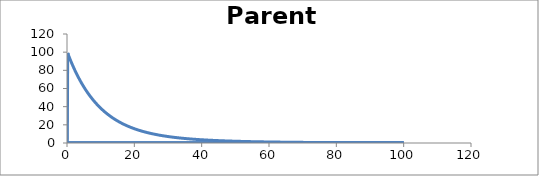
| Category | C - Sys 1 |
|---|---|
| 0.1 | 0 |
| 0.2 | 99.005 |
| 0.3 | 98.022 |
| 0.4 | 97.049 |
| 0.5 | 96.086 |
| 0.6 | 95.133 |
| 0.7000000000000001 | 94.191 |
| 0.8 | 93.259 |
| 0.9000000000000001 | 92.336 |
| 1.0 | 91.423 |
| 1.0999999999999999 | 90.52 |
| 1.2 | 89.626 |
| 1.3 | 88.742 |
| 1.4000000000000001 | 87.867 |
| 1.5 | 87.001 |
| 1.6 | 86.144 |
| 1.7000000000000002 | 85.296 |
| 1.8000000000000003 | 84.457 |
| 1.9 | 83.626 |
| 2.0 | 82.805 |
| 2.1 | 81.991 |
| 2.1999999999999997 | 81.187 |
| 2.3 | 80.39 |
| 2.4 | 79.602 |
| 2.5 | 78.822 |
| 2.6 | 78.05 |
| 2.7 | 77.286 |
| 2.8000000000000003 | 76.53 |
| 2.9000000000000004 | 75.782 |
| 3.0 | 75.042 |
| 3.1 | 74.309 |
| 3.2 | 73.584 |
| 3.3000000000000003 | 72.867 |
| 3.4000000000000004 | 72.157 |
| 3.5000000000000004 | 71.454 |
| 3.6000000000000005 | 70.759 |
| 3.6999999999999997 | 70.07 |
| 3.8 | 69.389 |
| 3.9 | 68.715 |
| 4.0 | 68.048 |
| 4.1000000000000005 | 67.388 |
| 4.2 | 66.734 |
| 4.300000000000001 | 66.088 |
| 4.3999999999999995 | 65.448 |
| 4.5 | 64.814 |
| 4.6 | 64.187 |
| 4.7 | 63.567 |
| 4.8 | 62.953 |
| 4.9 | 62.345 |
| 5.0 | 61.744 |
| 5.1000000000000005 | 61.149 |
| 5.2 | 60.56 |
| 5.3 | 59.977 |
| 5.4 | 59.4 |
| 5.5 | 58.828 |
| 5.6000000000000005 | 58.263 |
| 5.7 | 57.704 |
| 5.800000000000001 | 57.15 |
| 5.9 | 56.602 |
| 6.0 | 56.06 |
| 6.1 | 55.523 |
| 6.2 | 54.992 |
| 6.3 | 54.466 |
| 6.4 | 53.946 |
| 6.5 | 53.431 |
| 6.6000000000000005 | 52.921 |
| 6.7 | 52.416 |
| 6.800000000000001 | 51.917 |
| 6.9 | 51.423 |
| 7.000000000000001 | 50.933 |
| 7.1000000000000005 | 50.449 |
| 7.200000000000001 | 49.97 |
| 7.3 | 49.496 |
| 7.3999999999999995 | 49.026 |
| 7.5 | 48.561 |
| 7.6 | 48.101 |
| 7.7 | 47.646 |
| 7.8 | 47.195 |
| 7.9 | 46.749 |
| 8.0 | 46.308 |
| 8.1 | 45.871 |
| 8.200000000000001 | 45.438 |
| 8.3 | 45.01 |
| 8.4 | 44.587 |
| 8.5 | 44.167 |
| 8.600000000000001 | 43.752 |
| 8.700000000000001 | 43.341 |
| 8.799999999999999 | 42.934 |
| 8.9 | 42.532 |
| 9.0 | 42.133 |
| 9.1 | 41.739 |
| 9.2 | 41.348 |
| 9.3 | 40.962 |
| 9.4 | 40.579 |
| 9.5 | 40.2 |
| 9.6 | 39.825 |
| 9.700000000000001 | 39.454 |
| 9.8 | 39.087 |
| 9.9 | 38.723 |
| 10.0 | 38.363 |
| 10.100000000000001 | 38.007 |
| 10.200000000000001 | 37.654 |
| 10.3 | 37.305 |
| 10.4 | 36.959 |
| 10.5 | 36.617 |
| 10.6 | 36.279 |
| 10.7 | 35.943 |
| 10.8 | 35.612 |
| 10.9 | 35.283 |
| 11.0 | 34.958 |
| 11.1 | 34.636 |
| 11.200000000000001 | 34.317 |
| 11.3 | 34.002 |
| 11.4 | 33.689 |
| 11.5 | 33.38 |
| 11.600000000000001 | 33.074 |
| 11.700000000000001 | 32.771 |
| 11.8 | 32.471 |
| 11.9 | 32.174 |
| 12.0 | 31.88 |
| 12.1 | 31.589 |
| 12.2 | 31.301 |
| 12.3 | 31.016 |
| 12.4 | 30.733 |
| 12.5 | 30.454 |
| 12.6 | 30.177 |
| 12.7 | 29.903 |
| 12.8 | 29.632 |
| 12.9 | 29.363 |
| 13.0 | 29.097 |
| 13.100000000000001 | 28.834 |
| 13.200000000000001 | 28.574 |
| 13.3 | 28.316 |
| 13.4 | 28.06 |
| 13.5 | 27.807 |
| 13.600000000000001 | 27.557 |
| 13.700000000000001 | 27.309 |
| 13.8 | 27.064 |
| 13.900000000000002 | 26.821 |
| 14.000000000000002 | 26.58 |
| 14.100000000000001 | 26.342 |
| 14.200000000000001 | 26.106 |
| 14.3 | 25.873 |
| 14.400000000000002 | 25.641 |
| 14.499999999999998 | 25.413 |
| 14.6 | 25.186 |
| 14.7 | 24.962 |
| 14.799999999999999 | 24.74 |
| 14.899999999999999 | 24.52 |
| 15.0 | 24.302 |
| 15.1 | 24.086 |
| 15.2 | 23.873 |
| 15.299999999999999 | 23.661 |
| 15.4 | 23.452 |
| 15.5 | 23.245 |
| 15.6 | 23.039 |
| 15.7 | 22.836 |
| 15.8 | 22.635 |
| 15.9 | 22.436 |
| 16.0 | 22.239 |
| 16.1 | 22.043 |
| 16.2 | 21.85 |
| 16.3 | 21.658 |
| 16.400000000000002 | 21.469 |
| 16.5 | 21.281 |
| 16.6 | 21.095 |
| 16.7 | 20.911 |
| 16.8 | 20.729 |
| 16.900000000000002 | 20.548 |
| 17.0 | 20.369 |
| 17.1 | 20.192 |
| 17.200000000000003 | 20.017 |
| 17.3 | 19.843 |
| 17.400000000000002 | 19.671 |
| 17.5 | 19.501 |
| 17.599999999999998 | 19.333 |
| 17.7 | 19.166 |
| 17.8 | 19 |
| 17.9 | 18.837 |
| 18.0 | 18.675 |
| 18.099999999999998 | 18.514 |
| 18.2 | 18.355 |
| 18.3 | 18.198 |
| 18.4 | 18.042 |
| 18.5 | 17.887 |
| 18.6 | 17.734 |
| 18.7 | 17.583 |
| 18.8 | 17.433 |
| 18.9 | 17.284 |
| 19.0 | 17.137 |
| 19.1 | 16.992 |
| 19.2 | 16.847 |
| 19.3 | 16.704 |
| 19.400000000000002 | 16.563 |
| 19.5 | 16.423 |
| 19.6 | 16.284 |
| 19.7 | 16.146 |
| 19.8 | 16.01 |
| 19.900000000000002 | 15.875 |
| 20.0 | 15.742 |
| 20.1 | 15.609 |
| 20.200000000000003 | 15.478 |
| 20.3 | 15.349 |
| 20.400000000000002 | 15.22 |
| 20.5 | 15.093 |
| 20.6 | 14.967 |
| 20.700000000000003 | 14.842 |
| 20.8 | 14.718 |
| 20.9 | 14.596 |
| 21.0 | 14.474 |
| 21.099999999999998 | 14.354 |
| 21.2 | 14.235 |
| 21.3 | 14.117 |
| 21.4 | 14 |
| 21.5 | 13.884 |
| 21.6 | 13.77 |
| 21.7 | 13.656 |
| 21.8 | 13.544 |
| 21.9 | 13.432 |
| 22.0 | 13.322 |
| 22.1 | 13.213 |
| 22.2 | 13.104 |
| 22.3 | 12.997 |
| 22.400000000000002 | 12.891 |
| 22.5 | 12.786 |
| 22.6 | 12.681 |
| 22.7 | 12.578 |
| 22.8 | 12.476 |
| 22.900000000000002 | 12.374 |
| 23.0 | 12.274 |
| 23.1 | 12.175 |
| 23.200000000000003 | 12.076 |
| 23.3 | 11.978 |
| 23.400000000000002 | 11.882 |
| 23.5 | 11.786 |
| 23.6 | 11.691 |
| 23.700000000000003 | 11.597 |
| 23.8 | 11.504 |
| 23.900000000000002 | 11.412 |
| 24.0 | 11.32 |
| 24.099999999999998 | 11.23 |
| 24.2 | 11.14 |
| 24.3 | 11.051 |
| 24.4 | 10.963 |
| 24.5 | 10.876 |
| 24.6 | 10.789 |
| 24.7 | 10.703 |
| 24.8 | 10.619 |
| 24.9 | 10.534 |
| 25.0 | 10.451 |
| 25.1 | 10.369 |
| 25.2 | 10.287 |
| 25.3 | 10.206 |
| 25.4 | 10.125 |
| 25.5 | 10.046 |
| 25.6 | 9.967 |
| 25.7 | 9.889 |
| 25.8 | 9.812 |
| 25.900000000000002 | 9.735 |
| 26.0 | 9.659 |
| 26.1 | 9.584 |
| 26.200000000000003 | 9.509 |
| 26.3 | 9.435 |
| 26.400000000000002 | 9.362 |
| 26.5 | 9.289 |
| 26.6 | 9.217 |
| 26.700000000000003 | 9.146 |
| 26.8 | 9.075 |
| 26.900000000000002 | 9.005 |
| 27.0 | 8.936 |
| 27.1 | 8.867 |
| 27.200000000000003 | 8.799 |
| 27.3 | 8.732 |
| 27.400000000000002 | 8.665 |
| 27.500000000000004 | 8.599 |
| 27.6 | 8.533 |
| 27.700000000000003 | 8.468 |
| 27.800000000000004 | 8.403 |
| 27.900000000000002 | 8.339 |
| 28.000000000000004 | 8.276 |
| 28.1 | 8.213 |
| 28.200000000000003 | 8.151 |
| 28.300000000000004 | 8.089 |
| 28.400000000000002 | 8.028 |
| 28.500000000000004 | 7.967 |
| 28.6 | 7.907 |
| 28.700000000000003 | 7.848 |
| 28.800000000000004 | 7.789 |
| 28.9 | 7.73 |
| 28.999999999999996 | 7.673 |
| 29.099999999999998 | 7.615 |
| 29.2 | 7.558 |
| 29.299999999999997 | 7.502 |
| 29.4 | 7.446 |
| 29.5 | 7.39 |
| 29.599999999999998 | 7.336 |
| 29.7 | 7.281 |
| 29.799999999999997 | 7.227 |
| 29.9 | 7.174 |
| 30.0 | 7.121 |
| 30.099999999999998 | 7.068 |
| 30.2 | 7.016 |
| 30.3 | 6.964 |
| 30.4 | 6.913 |
| 30.5 | 6.862 |
| 30.599999999999998 | 6.812 |
| 30.7 | 6.762 |
| 30.8 | 6.713 |
| 30.9 | 6.664 |
| 31.0 | 6.615 |
| 31.1 | 6.567 |
| 31.2 | 6.519 |
| 31.3 | 6.472 |
| 31.4 | 6.425 |
| 31.5 | 6.379 |
| 31.6 | 6.333 |
| 31.7 | 6.287 |
| 31.8 | 6.242 |
| 31.900000000000002 | 6.197 |
| 32.0 | 6.152 |
| 32.1 | 6.108 |
| 32.2 | 6.064 |
| 32.300000000000004 | 6.021 |
| 32.4 | 5.978 |
| 32.5 | 5.935 |
| 32.6 | 5.893 |
| 32.7 | 5.851 |
| 32.800000000000004 | 5.809 |
| 32.9 | 5.768 |
| 33.0 | 5.727 |
| 33.1 | 5.687 |
| 33.2 | 5.647 |
| 33.300000000000004 | 5.607 |
| 33.4 | 5.567 |
| 33.5 | 5.528 |
| 33.6 | 5.489 |
| 33.7 | 5.451 |
| 33.800000000000004 | 5.413 |
| 33.900000000000006 | 5.375 |
| 34.0 | 5.337 |
| 34.1 | 5.3 |
| 34.2 | 5.263 |
| 34.300000000000004 | 5.226 |
| 34.400000000000006 | 5.19 |
| 34.5 | 5.154 |
| 34.6 | 5.118 |
| 34.7 | 5.083 |
| 34.800000000000004 | 5.048 |
| 34.900000000000006 | 5.013 |
| 35.0 | 4.979 |
| 35.1 | 4.944 |
| 35.199999999999996 | 4.91 |
| 35.3 | 4.877 |
| 35.4 | 4.843 |
| 35.5 | 4.81 |
| 35.6 | 4.777 |
| 35.699999999999996 | 4.745 |
| 35.8 | 4.712 |
| 35.9 | 4.68 |
| 36.0 | 4.649 |
| 36.1 | 4.617 |
| 36.199999999999996 | 4.586 |
| 36.3 | 4.555 |
| 36.4 | 4.524 |
| 36.5 | 4.494 |
| 36.6 | 4.463 |
| 36.7 | 4.433 |
| 36.8 | 4.404 |
| 36.9 | 4.374 |
| 37.0 | 4.345 |
| 37.1 | 4.316 |
| 37.2 | 4.287 |
| 37.3 | 4.258 |
| 37.4 | 4.23 |
| 37.5 | 4.202 |
| 37.6 | 4.174 |
| 37.7 | 4.146 |
| 37.8 | 4.119 |
| 37.9 | 4.092 |
| 38.0 | 4.065 |
| 38.1 | 4.038 |
| 38.2 | 4.011 |
| 38.3 | 3.985 |
| 38.4 | 3.959 |
| 38.5 | 3.933 |
| 38.6 | 3.907 |
| 38.7 | 3.882 |
| 38.800000000000004 | 3.856 |
| 38.9 | 3.831 |
| 39.0 | 3.806 |
| 39.1 | 3.781 |
| 39.2 | 3.757 |
| 39.300000000000004 | 3.733 |
| 39.4 | 3.708 |
| 39.5 | 3.684 |
| 39.6 | 3.661 |
| 39.7 | 3.637 |
| 39.800000000000004 | 3.614 |
| 39.900000000000006 | 3.59 |
| 40.0 | 3.567 |
| 40.1 | 3.544 |
| 40.2 | 3.522 |
| 40.300000000000004 | 3.499 |
| 40.400000000000006 | 3.477 |
| 40.5 | 3.455 |
| 40.6 | 3.433 |
| 40.7 | 3.411 |
| 40.800000000000004 | 3.389 |
| 40.900000000000006 | 3.368 |
| 41.0 | 3.346 |
| 41.1 | 3.325 |
| 41.2 | 3.304 |
| 41.300000000000004 | 3.283 |
| 41.400000000000006 | 3.263 |
| 41.5 | 3.242 |
| 41.6 | 3.222 |
| 41.699999999999996 | 3.202 |
| 41.8 | 3.182 |
| 41.9 | 3.162 |
| 42.0 | 3.142 |
| 42.1 | 3.122 |
| 42.199999999999996 | 3.103 |
| 42.3 | 3.084 |
| 42.4 | 3.064 |
| 42.5 | 3.045 |
| 42.6 | 3.027 |
| 42.699999999999996 | 3.008 |
| 42.8 | 2.989 |
| 42.9 | 2.971 |
| 43.0 | 2.952 |
| 43.1 | 2.934 |
| 43.2 | 2.916 |
| 43.3 | 2.898 |
| 43.4 | 2.881 |
| 43.5 | 2.863 |
| 43.6 | 2.845 |
| 43.7 | 2.828 |
| 43.8 | 2.811 |
| 43.9 | 2.794 |
| 44.0 | 2.777 |
| 44.1 | 2.76 |
| 44.2 | 2.743 |
| 44.3 | 2.726 |
| 44.4 | 2.71 |
| 44.5 | 2.694 |
| 44.6 | 2.677 |
| 44.7 | 2.661 |
| 44.800000000000004 | 2.645 |
| 44.9 | 2.629 |
| 45.0 | 2.613 |
| 45.1 | 2.598 |
| 45.2 | 2.582 |
| 45.300000000000004 | 2.567 |
| 45.4 | 2.551 |
| 45.5 | 2.536 |
| 45.6 | 2.521 |
| 45.7 | 2.506 |
| 45.800000000000004 | 2.491 |
| 45.9 | 2.476 |
| 46.0 | 2.462 |
| 46.1 | 2.447 |
| 46.2 | 2.433 |
| 46.300000000000004 | 2.418 |
| 46.400000000000006 | 2.404 |
| 46.5 | 2.39 |
| 46.6 | 2.376 |
| 46.7 | 2.362 |
| 46.800000000000004 | 2.348 |
| 46.900000000000006 | 2.334 |
| 47.0 | 2.32 |
| 47.1 | 2.307 |
| 47.2 | 2.293 |
| 47.300000000000004 | 2.28 |
| 47.400000000000006 | 2.267 |
| 47.5 | 2.254 |
| 47.6 | 2.24 |
| 47.7 | 2.227 |
| 47.800000000000004 | 2.214 |
| 47.900000000000006 | 2.202 |
| 48.0 | 2.189 |
| 48.1 | 2.176 |
| 48.199999999999996 | 2.164 |
| 48.3 | 2.151 |
| 48.4 | 2.139 |
| 48.5 | 2.127 |
| 48.6 | 2.114 |
| 48.699999999999996 | 2.102 |
| 48.8 | 2.09 |
| 48.9 | 2.078 |
| 49.0 | 2.066 |
| 49.1 | 2.054 |
| 49.2 | 2.043 |
| 49.3 | 2.031 |
| 49.4 | 2.02 |
| 49.5 | 2.008 |
| 49.6 | 1.997 |
| 49.7 | 1.985 |
| 49.8 | 1.974 |
| 49.9 | 1.963 |
| 50.0 | 1.952 |
| 50.1 | 1.941 |
| 50.2 | 1.93 |
| 50.3 | 1.919 |
| 50.4 | 1.908 |
| 50.5 | 1.897 |
| 50.6 | 1.887 |
| 50.7 | 1.876 |
| 50.8 | 1.866 |
| 50.9 | 1.855 |
| 51.0 | 1.845 |
| 51.1 | 1.834 |
| 51.2 | 1.824 |
| 51.300000000000004 | 1.814 |
| 51.4 | 1.804 |
| 51.5 | 1.794 |
| 51.6 | 1.784 |
| 51.7 | 1.774 |
| 51.800000000000004 | 1.764 |
| 51.9 | 1.754 |
| 52.0 | 1.745 |
| 52.1 | 1.735 |
| 52.2 | 1.726 |
| 52.300000000000004 | 1.716 |
| 52.400000000000006 | 1.707 |
| 52.5 | 1.697 |
| 52.6 | 1.688 |
| 52.7 | 1.679 |
| 52.800000000000004 | 1.669 |
| 52.900000000000006 | 1.66 |
| 53.0 | 1.651 |
| 53.1 | 1.642 |
| 53.2 | 1.633 |
| 53.300000000000004 | 1.624 |
| 53.400000000000006 | 1.615 |
| 53.5 | 1.607 |
| 53.6 | 1.598 |
| 53.7 | 1.589 |
| 53.800000000000004 | 1.58 |
| 53.900000000000006 | 1.572 |
| 54.0 | 1.563 |
| 54.1 | 1.555 |
| 54.2 | 1.546 |
| 54.300000000000004 | 1.538 |
| 54.400000000000006 | 1.53 |
| 54.50000000000001 | 1.522 |
| 54.6 | 1.513 |
| 54.7 | 1.505 |
| 54.800000000000004 | 1.497 |
| 54.900000000000006 | 1.489 |
| 55.00000000000001 | 1.481 |
| 55.1 | 1.473 |
| 55.2 | 1.465 |
| 55.300000000000004 | 1.457 |
| 55.400000000000006 | 1.45 |
| 55.50000000000001 | 1.442 |
| 55.60000000000001 | 1.434 |
| 55.7 | 1.426 |
| 55.800000000000004 | 1.419 |
| 55.900000000000006 | 1.411 |
| 56.00000000000001 | 1.404 |
| 56.10000000000001 | 1.396 |
| 56.2 | 1.389 |
| 56.300000000000004 | 1.382 |
| 56.400000000000006 | 1.374 |
| 56.50000000000001 | 1.367 |
| 56.60000000000001 | 1.36 |
| 56.7 | 1.353 |
| 56.800000000000004 | 1.345 |
| 56.900000000000006 | 1.338 |
| 57.00000000000001 | 1.331 |
| 57.10000000000001 | 1.324 |
| 57.2 | 1.317 |
| 57.300000000000004 | 1.31 |
| 57.400000000000006 | 1.304 |
| 57.50000000000001 | 1.297 |
| 57.60000000000001 | 1.29 |
| 57.699999999999996 | 1.283 |
| 57.8 | 1.276 |
| 57.9 | 1.27 |
| 57.99999999999999 | 1.263 |
| 58.099999999999994 | 1.256 |
| 58.199999999999996 | 1.25 |
| 58.3 | 1.243 |
| 58.4 | 1.237 |
| 58.5 | 1.231 |
| 58.599999999999994 | 1.224 |
| 58.699999999999996 | 1.218 |
| 58.8 | 1.211 |
| 58.9 | 1.205 |
| 59.0 | 1.199 |
| 59.099999999999994 | 1.193 |
| 59.199999999999996 | 1.187 |
| 59.3 | 1.18 |
| 59.4 | 1.174 |
| 59.5 | 1.168 |
| 59.599999999999994 | 1.162 |
| 59.699999999999996 | 1.156 |
| 59.8 | 1.15 |
| 59.9 | 1.144 |
| 60.0 | 1.138 |
| 60.099999999999994 | 1.133 |
| 60.199999999999996 | 1.127 |
| 60.3 | 1.121 |
| 60.4 | 1.115 |
| 60.5 | 1.11 |
| 60.6 | 1.104 |
| 60.699999999999996 | 1.098 |
| 60.8 | 1.093 |
| 60.9 | 1.087 |
| 61.0 | 1.082 |
| 61.1 | 1.076 |
| 61.199999999999996 | 1.071 |
| 61.3 | 1.065 |
| 61.4 | 1.06 |
| 61.5 | 1.054 |
| 61.6 | 1.049 |
| 61.7 | 1.044 |
| 61.8 | 1.038 |
| 61.9 | 1.033 |
| 62.0 | 1.028 |
| 62.1 | 1.023 |
| 62.2 | 1.017 |
| 62.3 | 1.012 |
| 62.4 | 1.007 |
| 62.5 | 1.002 |
| 62.6 | 0.997 |
| 62.7 | 0.992 |
| 62.8 | 0.987 |
| 62.9 | 0.982 |
| 63.0 | 0.977 |
| 63.1 | 0.972 |
| 63.2 | 0.967 |
| 63.3 | 0.962 |
| 63.4 | 0.958 |
| 63.5 | 0.953 |
| 63.6 | 0.948 |
| 63.7 | 0.943 |
| 63.800000000000004 | 0.939 |
| 63.9 | 0.934 |
| 64.0 | 0.929 |
| 64.1 | 0.925 |
| 64.2 | 0.92 |
| 64.3 | 0.915 |
| 64.4 | 0.911 |
| 64.5 | 0.906 |
| 64.60000000000001 | 0.902 |
| 64.7 | 0.897 |
| 64.8 | 0.893 |
| 64.9 | 0.888 |
| 65.0 | 0.884 |
| 65.10000000000001 | 0.88 |
| 65.2 | 0.875 |
| 65.3 | 0.871 |
| 65.4 | 0.867 |
| 65.5 | 0.862 |
| 65.60000000000001 | 0.858 |
| 65.7 | 0.854 |
| 65.8 | 0.85 |
| 65.9 | 0.845 |
| 66.0 | 0.841 |
| 66.10000000000001 | 0.837 |
| 66.2 | 0.833 |
| 66.3 | 0.829 |
| 66.4 | 0.825 |
| 66.5 | 0.821 |
| 66.60000000000001 | 0.817 |
| 66.7 | 0.813 |
| 66.8 | 0.809 |
| 66.9 | 0.805 |
| 67.0 | 0.801 |
| 67.10000000000001 | 0.797 |
| 67.2 | 0.793 |
| 67.30000000000001 | 0.789 |
| 67.4 | 0.785 |
| 67.5 | 0.781 |
| 67.60000000000001 | 0.778 |
| 67.7 | 0.774 |
| 67.80000000000001 | 0.77 |
| 67.9 | 0.766 |
| 68.0 | 0.762 |
| 68.10000000000001 | 0.759 |
| 68.2 | 0.755 |
| 68.30000000000001 | 0.751 |
| 68.4 | 0.748 |
| 68.5 | 0.744 |
| 68.60000000000001 | 0.74 |
| 68.7 | 0.737 |
| 68.80000000000001 | 0.733 |
| 68.9 | 0.73 |
| 69.0 | 0.726 |
| 69.10000000000001 | 0.723 |
| 69.2 | 0.719 |
| 69.30000000000001 | 0.716 |
| 69.4 | 0.712 |
| 69.5 | 0.709 |
| 69.60000000000001 | 0.705 |
| 69.7 | 0.702 |
| 69.80000000000001 | 0.699 |
| 69.9 | 0.695 |
| 70.0 | 0.692 |
| 70.10000000000001 | 0.688 |
| 70.2 | 0.685 |
| 70.30000000000001 | 0.682 |
| 70.39999999999999 | 0.679 |
| 70.5 | 0.675 |
| 70.6 | 0.672 |
| 70.7 | 0.669 |
| 70.8 | 0.666 |
| 70.89999999999999 | 0.662 |
| 71.0 | 0.659 |
| 71.1 | 0.656 |
| 71.2 | 0.653 |
| 71.3 | 0.65 |
| 71.39999999999999 | 0.647 |
| 71.5 | 0.644 |
| 71.6 | 0.64 |
| 71.7 | 0.637 |
| 71.8 | 0.634 |
| 71.89999999999999 | 0.631 |
| 72.0 | 0.628 |
| 72.1 | 0.625 |
| 72.2 | 0.622 |
| 72.3 | 0.619 |
| 72.39999999999999 | 0.616 |
| 72.5 | 0.613 |
| 72.6 | 0.611 |
| 72.7 | 0.608 |
| 72.8 | 0.605 |
| 72.89999999999999 | 0.602 |
| 73.0 | 0.599 |
| 73.1 | 0.596 |
| 73.2 | 0.593 |
| 73.3 | 0.59 |
| 73.4 | 0.588 |
| 73.5 | 0.585 |
| 73.6 | 0.582 |
| 73.7 | 0.579 |
| 73.8 | 0.577 |
| 73.9 | 0.574 |
| 74.0 | 0.571 |
| 74.1 | 0.568 |
| 74.2 | 0.566 |
| 74.3 | 0.563 |
| 74.4 | 0.56 |
| 74.5 | 0.558 |
| 74.6 | 0.555 |
| 74.7 | 0.552 |
| 74.8 | 0.55 |
| 74.9 | 0.547 |
| 75.0 | 0.545 |
| 75.1 | 0.542 |
| 75.2 | 0.539 |
| 75.3 | 0.537 |
| 75.4 | 0.534 |
| 75.5 | 0.532 |
| 75.6 | 0.529 |
| 75.7 | 0.527 |
| 75.8 | 0.524 |
| 75.9 | 0.522 |
| 76.0 | 0.519 |
| 76.1 | 0.517 |
| 76.2 | 0.515 |
| 76.3 | 0.512 |
| 76.4 | 0.51 |
| 76.5 | 0.507 |
| 76.6 | 0.505 |
| 76.7 | 0.503 |
| 76.8 | 0.5 |
| 76.9 | 0.498 |
| 77.0 | 0.496 |
| 77.10000000000001 | 0.493 |
| 77.2 | 0.491 |
| 77.3 | 0.489 |
| 77.4 | 0.486 |
| 77.5 | 0.484 |
| 77.60000000000001 | 0.482 |
| 77.7 | 0.48 |
| 77.8 | 0.477 |
| 77.9 | 0.475 |
| 78.0 | 0.473 |
| 78.10000000000001 | 0.471 |
| 78.2 | 0.468 |
| 78.3 | 0.466 |
| 78.4 | 0.464 |
| 78.5 | 0.462 |
| 78.60000000000001 | 0.46 |
| 78.7 | 0.458 |
| 78.8 | 0.455 |
| 78.9 | 0.453 |
| 79.0 | 0.451 |
| 79.10000000000001 | 0.449 |
| 79.2 | 0.447 |
| 79.3 | 0.445 |
| 79.4 | 0.443 |
| 79.5 | 0.441 |
| 79.60000000000001 | 0.439 |
| 79.7 | 0.437 |
| 79.80000000000001 | 0.435 |
| 79.9 | 0.433 |
| 80.0 | 0.431 |
| 80.10000000000001 | 0.429 |
| 80.2 | 0.427 |
| 80.30000000000001 | 0.425 |
| 80.4 | 0.423 |
| 80.5 | 0.421 |
| 80.60000000000001 | 0.419 |
| 80.7 | 0.417 |
| 80.80000000000001 | 0.415 |
| 80.9 | 0.413 |
| 81.0 | 0.411 |
| 81.10000000000001 | 0.409 |
| 81.2 | 0.407 |
| 81.30000000000001 | 0.405 |
| 81.4 | 0.403 |
| 81.5 | 0.402 |
| 81.60000000000001 | 0.4 |
| 81.7 | 0.398 |
| 81.80000000000001 | 0.396 |
| 81.9 | 0.394 |
| 82.0 | 0.392 |
| 82.10000000000001 | 0.391 |
| 82.2 | 0.389 |
| 82.30000000000001 | 0.387 |
| 82.4 | 0.385 |
| 82.5 | 0.383 |
| 82.60000000000001 | 0.382 |
| 82.7 | 0.38 |
| 82.80000000000001 | 0.378 |
| 82.9 | 0.376 |
| 83.0 | 0.375 |
| 83.10000000000001 | 0.373 |
| 83.2 | 0.371 |
| 83.3 | 0.37 |
| 83.39999999999999 | 0.368 |
| 83.5 | 0.366 |
| 83.6 | 0.364 |
| 83.7 | 0.363 |
| 83.8 | 0.361 |
| 83.89999999999999 | 0.359 |
| 84.0 | 0.358 |
| 84.1 | 0.356 |
| 84.2 | 0.354 |
| 84.3 | 0.353 |
| 84.39999999999999 | 0.351 |
| 84.5 | 0.35 |
| 84.6 | 0.348 |
| 84.7 | 0.346 |
| 84.8 | 0.345 |
| 84.89999999999999 | 0.343 |
| 85.0 | 0.342 |
| 85.1 | 0.34 |
| 85.2 | 0.339 |
| 85.3 | 0.337 |
| 85.39999999999999 | 0.335 |
| 85.5 | 0.334 |
| 85.6 | 0.332 |
| 85.7 | 0.331 |
| 85.8 | 0.329 |
| 85.9 | 0.328 |
| 86.0 | 0.326 |
| 86.1 | 0.325 |
| 86.2 | 0.323 |
| 86.3 | 0.322 |
| 86.4 | 0.32 |
| 86.5 | 0.319 |
| 86.6 | 0.317 |
| 86.7 | 0.316 |
| 86.8 | 0.315 |
| 86.9 | 0.313 |
| 87.0 | 0.312 |
| 87.1 | 0.31 |
| 87.2 | 0.309 |
| 87.3 | 0.307 |
| 87.4 | 0.306 |
| 87.5 | 0.305 |
| 87.6 | 0.303 |
| 87.7 | 0.302 |
| 87.8 | 0.3 |
| 87.9 | 0.299 |
| 88.0 | 0.298 |
| 88.1 | 0.296 |
| 88.2 | 0.295 |
| 88.3 | 0.294 |
| 88.4 | 0.292 |
| 88.5 | 0.291 |
| 88.6 | 0.29 |
| 88.7 | 0.288 |
| 88.8 | 0.287 |
| 88.9 | 0.286 |
| 89.0 | 0.284 |
| 89.1 | 0.283 |
| 89.2 | 0.282 |
| 89.3 | 0.281 |
| 89.4 | 0.279 |
| 89.5 | 0.278 |
| 89.60000000000001 | 0.277 |
| 89.7 | 0.275 |
| 89.8 | 0.274 |
| 89.9 | 0.273 |
| 90.0 | 0.272 |
| 90.10000000000001 | 0.27 |
| 90.2 | 0.269 |
| 90.3 | 0.268 |
| 90.4 | 0.267 |
| 90.5 | 0.266 |
| 90.60000000000001 | 0.264 |
| 90.7 | 0.263 |
| 90.8 | 0.262 |
| 90.9 | 0.261 |
| 91.0 | 0.26 |
| 91.10000000000001 | 0.258 |
| 91.2 | 0.257 |
| 91.3 | 0.256 |
| 91.4 | 0.255 |
| 91.5 | 0.254 |
| 91.60000000000001 | 0.253 |
| 91.7 | 0.251 |
| 91.8 | 0.25 |
| 91.9 | 0.249 |
| 92.0 | 0.248 |
| 92.10000000000001 | 0.247 |
| 92.2 | 0.246 |
| 92.30000000000001 | 0.245 |
| 92.4 | 0.244 |
| 92.5 | 0.242 |
| 92.60000000000001 | 0.241 |
| 92.7 | 0.24 |
| 92.80000000000001 | 0.239 |
| 92.9 | 0.238 |
| 93.0 | 0.237 |
| 93.10000000000001 | 0.236 |
| 93.2 | 0.235 |
| 93.30000000000001 | 0.234 |
| 93.4 | 0.233 |
| 93.5 | 0.232 |
| 93.60000000000001 | 0.231 |
| 93.7 | 0.23 |
| 93.80000000000001 | 0.229 |
| 93.9 | 0.228 |
| 94.0 | 0.226 |
| 94.10000000000001 | 0.225 |
| 94.2 | 0.224 |
| 94.30000000000001 | 0.223 |
| 94.4 | 0.222 |
| 94.5 | 0.221 |
| 94.60000000000001 | 0.22 |
| 94.7 | 0.219 |
| 94.80000000000001 | 0.218 |
| 94.9 | 0.217 |
| 95.0 | 0.216 |
| 95.10000000000001 | 0.215 |
| 95.2 | 0.215 |
| 95.30000000000001 | 0.214 |
| 95.4 | 0.213 |
| 95.5 | 0.212 |
| 95.60000000000001 | 0.211 |
| 95.7 | 0.21 |
| 95.80000000000001 | 0.209 |
| 95.9 | 0.208 |
| 96.0 | 0.207 |
| 96.1 | 0.206 |
| 96.2 | 0.205 |
| 96.3 | 0.204 |
| 96.39999999999999 | 0.203 |
| 96.5 | 0.202 |
| 96.6 | 0.201 |
| 96.7 | 0.2 |
| 96.8 | 0.2 |
| 96.89999999999999 | 0.199 |
| 97.0 | 0.198 |
| 97.1 | 0.197 |
| 97.2 | 0.196 |
| 97.3 | 0.195 |
| 97.39999999999999 | 0.194 |
| 97.5 | 0.193 |
| 97.6 | 0.192 |
| 97.7 | 0.192 |
| 97.8 | 0.191 |
| 97.89999999999999 | 0.19 |
| 98.0 | 0.189 |
| 98.1 | 0.188 |
| 98.2 | 0.187 |
| 98.3 | 0.186 |
| 98.4 | 0.186 |
| 98.5 | 0.185 |
| 98.6 | 0.184 |
| 98.7 | 0.183 |
| 98.8 | 0.182 |
| 98.9 | 0.181 |
| 99.0 | 0.181 |
| 99.1 | 0.18 |
| 99.2 | 0.179 |
| 99.3 | 0.178 |
| 99.4 | 0.177 |
| 99.5 | 0.177 |
| 99.6 | 0.176 |
| 99.7 | 0.175 |
| 99.8 | 0.174 |
| 99.9 | 0.173 |
| 100.0 | 0.173 |